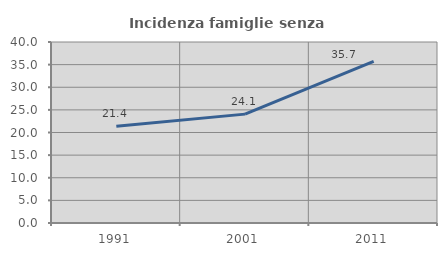
| Category | Incidenza famiglie senza nuclei |
|---|---|
| 1991.0 | 21.359 |
| 2001.0 | 24.059 |
| 2011.0 | 35.724 |